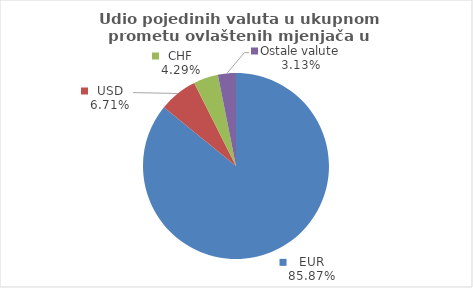
| Category | Series 0 |
|---|---|
| EUR | 85.873 |
| USD | 6.711 |
| CHF | 4.286 |
| Ostale valute | 3.13 |